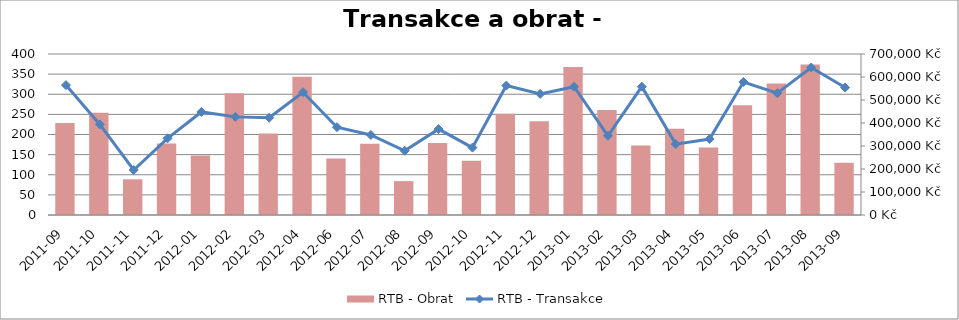
| Category | RTB - Obrat |
|---|---|
| 2011-09 | 400328.078 |
| 2011-10 | 444584.805 |
| 2011-11 | 155190.675 |
| 2011-12 | 310663.688 |
| 2012-01 | 258680.225 |
| 2012-02 | 529440.135 |
| 2012-03 | 354397.151 |
| 2012-04 | 600621.149 |
| 2012-06 | 245305.155 |
| 2012-07 | 310086 |
| 2012-08 | 147353.773 |
| 2012-09 | 313526.257 |
| 2012-10 | 236128.286 |
| 2012-11 | 440137.451 |
| 2012-12 | 407849.326 |
| 2013-01 | 643484.084 |
| 2013-02 | 456204.159 |
| 2013-03 | 302218.017 |
| 2013-04 | 375069.843 |
| 2013-05 | 293624.167 |
| 2013-06 | 477174.193 |
| 2013-07 | 571662.449 |
| 2013-08 | 654036.856 |
| 2013-09 | 227356.535 |